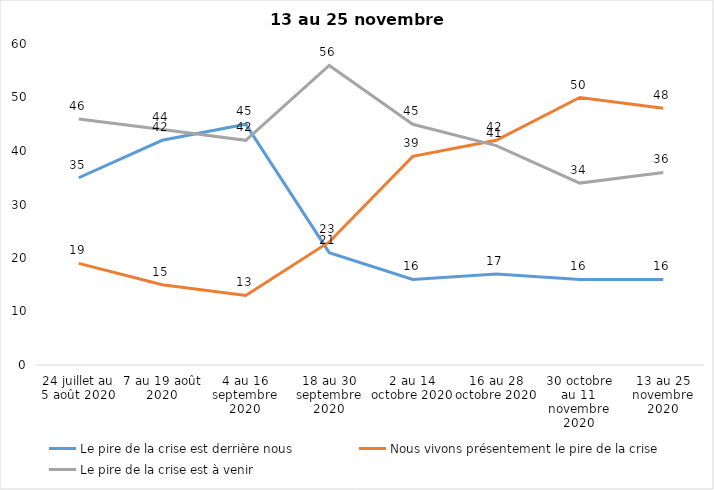
| Category | Le pire de la crise est derrière nous | Nous vivons présentement le pire de la crise | Le pire de la crise est à venir |
|---|---|---|---|
| 24 juillet au 5 août 2020 | 35 | 19 | 46 |
| 7 au 19 août 2020 | 42 | 15 | 44 |
| 4 au 16 septembre 2020 | 45 | 13 | 42 |
| 18 au 30 septembre 2020 | 21 | 23 | 56 |
| 2 au 14 octobre 2020 | 16 | 39 | 45 |
| 16 au 28 octobre 2020 | 17 | 42 | 41 |
| 30 octobre au 11 novembre 2020 | 16 | 50 | 34 |
| 13 au 25 novembre 2020 | 16 | 48 | 36 |